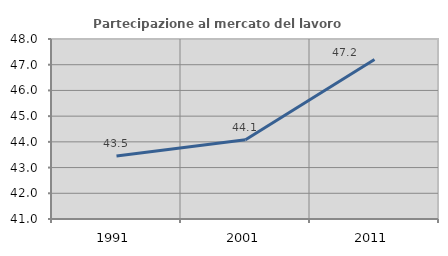
| Category | Partecipazione al mercato del lavoro  femminile |
|---|---|
| 1991.0 | 43.452 |
| 2001.0 | 44.08 |
| 2011.0 | 47.206 |